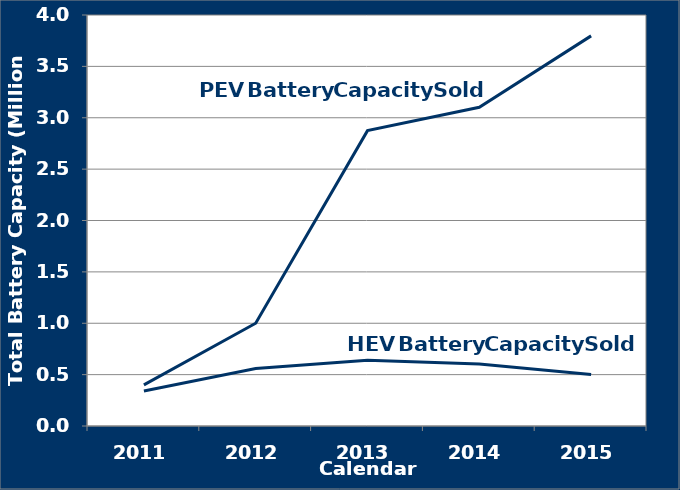
| Category | HEV | PEV |
|---|---|---|
| 2011.0 | 0.34 | 0.4 |
| 2012.0 | 0.56 | 1 |
| 2013.0 | 0.64 | 2.875 |
| 2014.0 | 0.603 | 3.102 |
| 2015.0 | 0.501 | 3.797 |